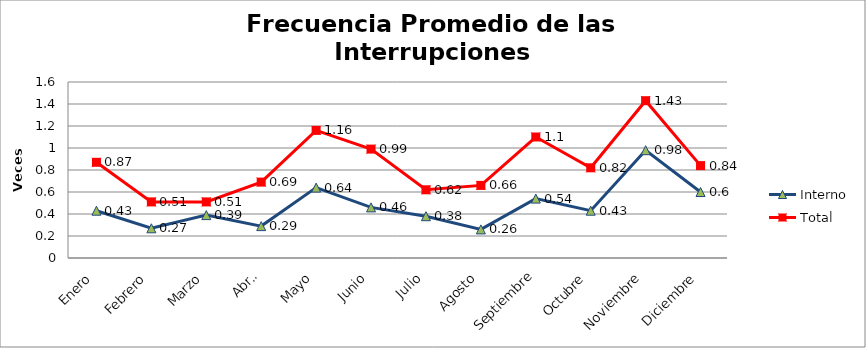
| Category | Interno | Total |
|---|---|---|
| Enero | 0.43 | 0.87 |
| Febrero | 0.27 | 0.51 |
| Marzo | 0.39 | 0.51 |
| Abril | 0.29 | 0.69 |
| Mayo | 0.64 | 1.16 |
| Junio | 0.46 | 0.99 |
| Julio | 0.38 | 0.62 |
| Agosto | 0.26 | 0.66 |
| Septiembre | 0.54 | 1.1 |
| Octubre | 0.43 | 0.82 |
| Noviembre | 0.98 | 1.43 |
| Diciembre | 0.6 | 0.84 |